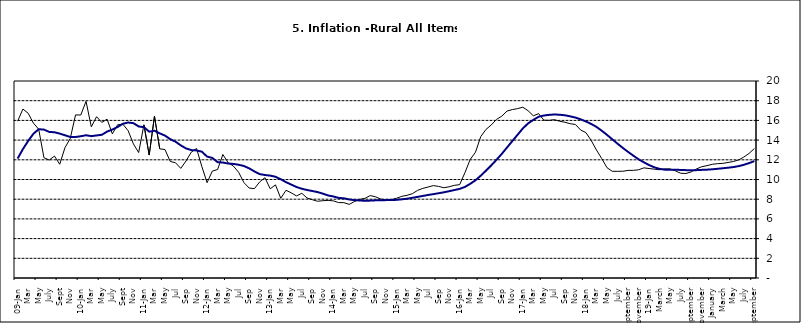
| Category | Series 0 | Series 1 |
|---|---|---|
| 09-Jan | 15.918 | 12.128 |
| Feb | 17.154 | 13.086 |
| Mar | 16.729 | 13.912 |
| Apr | 15.727 | 14.644 |
| May | 15.113 | 15.104 |
| June | 12.213 | 15.067 |
| July | 11.974 | 14.832 |
| Aug | 12.38 | 14.796 |
| Sept | 11.548 | 14.661 |
| Oct | 13.242 | 14.488 |
| Nov | 14.164 | 14.321 |
|  | 16.557 | 14.316 |
| 10-Jan | 16.548 | 14.39 |
| Feb | 17.934 | 14.494 |
| Mar | 15.346 | 14.401 |
| Apr | 16.373 | 14.473 |
| May | 15.794 | 14.54 |
| June | 16.126 | 14.862 |
| July | 14.634 | 15.072 |
| Aug | 15.556 | 15.33 |
| Sept | 15.616 | 15.658 |
| Oct | 14.955 | 15.786 |
| Nov | 13.616 | 15.719 |
| Dec | 12.735 | 15.385 |
| 11-Jan | 15.553 | 15.311 |
| Feb | 12.482 | 14.856 |
| Mar | 16.422 | 14.956 |
| Apr | 13.117 | 14.687 |
| May | 13.041 | 14.457 |
| Jun | 11.83 | 14.095 |
| Jul | 11.699 | 13.84 |
| Aug | 11.13 | 13.464 |
| Sep | 11.878 | 13.156 |
| Oct | 12.778 | 12.985 |
| Nov | 13.147 | 12.95 |
| Dec | 11.326 | 12.824 |
| 12-Jan | 9.678 | 12.33 |
| Feb | 10.856 | 12.188 |
| Mar | 11.014 | 11.76 |
| Apr | 12.536 | 11.724 |
| May | 11.712 | 11.621 |
| Jun | 11.36 | 11.582 |
| Jul | 10.733 | 11.499 |
| Aug | 9.683 | 11.368 |
| Sep | 9.132 | 11.131 |
| Oct | 9.071 | 10.82 |
| Nov | 9.758 | 10.548 |
| Dec | 10.183 | 10.455 |
| 13-Jan | 9.052 | 10.394 |
| Feb | 9.457 | 10.276 |
| Mar | 8.091 | 10.025 |
| Apr | 8.907 | 9.732 |
| May | 8.647 | 9.483 |
| Jun | 8.333 | 9.236 |
| Jul | 8.6 | 9.063 |
| Aug | 8.12 | 8.933 |
| Sep | 7.95 | 8.832 |
| Oct | 7.791 | 8.722 |
| Nov | 7.849 | 8.565 |
| Dec | 7.879 | 8.378 |
| 14-Jan | 7.832 | 8.277 |
| Feb | 7.657 | 8.13 |
| Mar | 7.65 | 8.092 |
| Apr | 7.473 | 7.973 |
| May | 7.761 | 7.901 |
| Jun | 7.98 | 7.874 |
| Jul | 8.086 | 7.834 |
| Aug | 8.368 | 7.858 |
| Sep | 8.244 | 7.883 |
| Oct | 8.019 | 7.903 |
| Nov | 7.898 | 7.906 |
| Dec | 7.955 | 7.913 |
| 15-Jan | 8.094 | 7.935 |
| Feb | 8.291 | 7.988 |
| Mar | 8.396 | 8.05 |
| Apr | 8.556 | 8.14 |
| May | 8.896 | 8.236 |
| Jun | 9.098 | 8.331 |
| Jul | 9.238 | 8.429 |
| Aug | 9.382 | 8.516 |
| Sep | 9.3 | 8.606 |
| Oct | 9.162 | 8.7 |
| Nov | 9.261 | 8.813 |
| Dec | 9.41 | 8.933 |
| 16-Jan | 9.48 | 9.047 |
| Feb | 10.692 | 9.249 |
| Mar | 12.038 | 9.559 |
| Apr | 12.767 | 9.917 |
| May | 14.349 | 10.384 |
| Jun | 15.088 | 10.897 |
| Jul | 15.533 | 11.433 |
| Aug | 16.103 | 12.002 |
| Sep | 16.428 | 12.601 |
| Oct | 16.947 | 13.25 |
| Nov | 17.099 | 13.898 |
| Dec | 17.195 | 14.54 |
| 17-Jan | 17.341 | 15.183 |
| Feb | 16.982 | 15.696 |
| Mar | 16.466 | 16.054 |
| Apr | 16.687 | 16.369 |
| May | 16.023 | 16.497 |
| Jun | 16.007 | 16.563 |
| Jul | 16.078 | 16.6 |
| Aug | 15.914 | 16.577 |
| Sep | 15.812 | 16.52 |
| Oct | 15.666 | 16.411 |
| Nov | 15.587 | 16.285 |
| Dec | 15.018 | 16.104 |
| 18-Jan | 14.756 | 15.892 |
| Feb | 13.957 | 15.638 |
| Mar | 12.987 | 15.339 |
| Apr | 12.126 | 14.95 |
| May | 11.199 | 14.53 |
| June | 10.832 | 14.083 |
| July | 10.831 | 13.636 |
| August | 10.838 | 13.209 |
| September | 10.924 | 12.804 |
| October | 10.927 | 12.418 |
| November | 10.986 | 12.049 |
| December | 11.183 | 11.746 |
| 19-Jan | 11.115 | 11.462 |
| February | 11.048 | 11.234 |
| March | 10.99 | 11.078 |
| April | 11.08 | 10.997 |
| May | 11.075 | 10.988 |
| June | 10.874 | 10.99 |
| July | 10.636 | 10.972 |
| August | 10.609 | 10.951 |
| September | 10.771 | 10.937 |
| October | 11.074 | 10.95 |
| November | 11.296 | 10.977 |
| December | 11.406 | 10.998 |
| January | 11.543 | 11.037 |
| February | 11.606 | 11.086 |
| March | 11.639 | 11.141 |
| April | 11.728 | 11.197 |
| May | 11.826 | 11.261 |
| June | 11.988 | 11.355 |
| July | 12.28 | 11.493 |
| August | 12.651 | 11.664 |
| September | 13.14 | 11.864 |